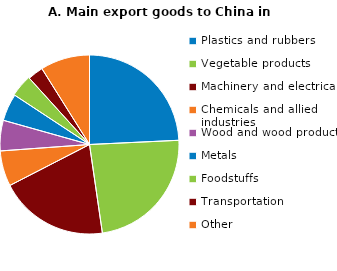
| Category | Series 0 |
|---|---|
| Plastics and rubbers | 24.2 |
| Vegetable products | 23.4 |
| Machinery and electrical | 19.7 |
| Chemicals and allied industries | 6.4 |
| Wood and wood products | 5.5 |
| Metals | 4.9 |
| Foodstuffs | 4 |
| Transportation | 2.8 |
| Other | 8.9 |